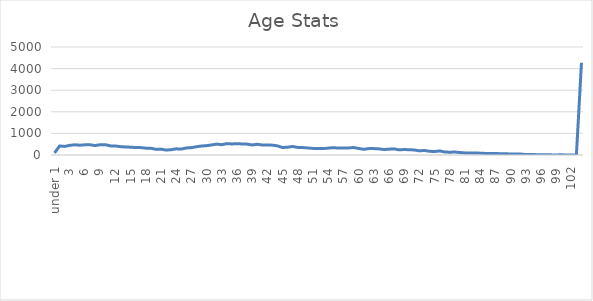
| Category | Series 0 |
|---|---|
| under 1 | 95 |
| 1 | 418 |
| 2 | 397 |
| 3 | 446 |
| 4 | 472 |
| 5 | 454 |
| 6 | 471 |
| 7 | 474 |
| 8 | 438 |
| 9 | 475 |
| 10 | 479 |
| 11 | 423 |
| 12 | 418 |
| 13 | 387 |
| 14 | 371 |
| 15 | 362 |
| 16 | 346 |
| 17 | 343 |
| 18 | 318 |
| 19 | 313 |
| 20 | 262 |
| 21 | 272 |
| 22 | 228 |
| 23 | 245 |
| 24 | 286 |
| 25 | 273 |
| 26 | 326 |
| 27 | 341 |
| 28 | 382 |
| 29 | 416 |
| 30 | 431 |
| 31 | 466 |
| 32 | 504 |
| 33 | 477 |
| 34 | 527 |
| 35 | 513 |
| 36 | 520 |
| 37 | 513 |
| 38 | 503 |
| 39 | 464 |
| 40 | 496 |
| 41 | 462 |
| 42 | 463 |
| 43 | 456 |
| 44 | 423 |
| 45 | 345 |
| 46 | 361 |
| 47 | 395 |
| 48 | 351 |
| 49 | 344 |
| 50 | 326 |
| 51 | 305 |
| 52 | 302 |
| 53 | 298 |
| 54 | 318 |
| 55 | 340 |
| 56 | 322 |
| 57 | 328 |
| 58 | 326 |
| 59 | 348 |
| 60 | 303 |
| 61 | 264 |
| 62 | 296 |
| 63 | 296 |
| 64 | 284 |
| 65 | 254 |
| 66 | 270 |
| 67 | 285 |
| 68 | 238 |
| 69 | 254 |
| 70 | 242 |
| 71 | 234 |
| 72 | 193 |
| 73 | 210 |
| 74 | 172 |
| 75 | 160 |
| 76 | 190 |
| 77 | 140 |
| 78 | 128 |
| 79 | 137 |
| 80 | 115 |
| 81 | 96 |
| 82 | 96 |
| 83 | 90 |
| 84 | 86 |
| 85 | 73 |
| 86 | 72 |
| 87 | 68 |
| 88 | 60 |
| 89 | 61 |
| 90 | 45 |
| 91 | 51 |
| 92 | 44 |
| 93 | 21 |
| 94 | 22 |
| 95 | 17 |
| 96 | 9 |
| 97 | 7 |
| 98 | 6 |
| 99 | 3 |
| 100 | 9 |
| 101 | 2 |
| 102 | 0 |
| 103 | 1 |
| Prefer not to answer | 4270 |